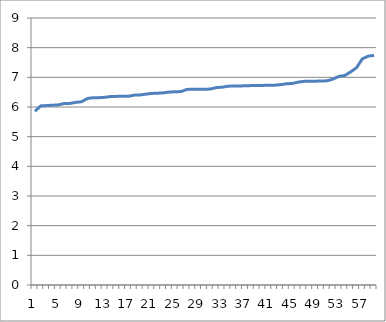
| Category | Series 0 |
|---|---|
| 0 | 5.858 |
| 1 | 6.038 |
| 2 | 6.048 |
| 3 | 6.06 |
| 4 | 6.07 |
| 5 | 6.118 |
| 6 | 6.12 |
| 7 | 6.157 |
| 8 | 6.179 |
| 9 | 6.288 |
| 10 | 6.313 |
| 11 | 6.315 |
| 12 | 6.328 |
| 13 | 6.354 |
| 14 | 6.358 |
| 15 | 6.363 |
| 16 | 6.363 |
| 17 | 6.4 |
| 18 | 6.408 |
| 19 | 6.433 |
| 20 | 6.458 |
| 21 | 6.465 |
| 22 | 6.478 |
| 23 | 6.503 |
| 24 | 6.515 |
| 25 | 6.52 |
| 26 | 6.593 |
| 27 | 6.598 |
| 28 | 6.599 |
| 29 | 6.6 |
| 30 | 6.605 |
| 31 | 6.653 |
| 32 | 6.668 |
| 33 | 6.7 |
| 34 | 6.71 |
| 35 | 6.711 |
| 36 | 6.713 |
| 37 | 6.723 |
| 38 | 6.724 |
| 39 | 6.728 |
| 40 | 6.733 |
| 41 | 6.735 |
| 42 | 6.753 |
| 43 | 6.783 |
| 44 | 6.793 |
| 45 | 6.838 |
| 46 | 6.865 |
| 47 | 6.867 |
| 48 | 6.87 |
| 49 | 6.877 |
| 50 | 6.883 |
| 51 | 6.945 |
| 52 | 7.033 |
| 53 | 7.063 |
| 54 | 7.183 |
| 55 | 7.324 |
| 56 | 7.625 |
| 57 | 7.713 |
| 58 | 7.74 |